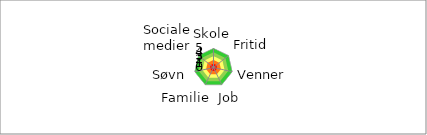
| Category | Series 5 | Series 4 | Series 3 | Series 2 | Series 1 | Series 0 |
|---|---|---|---|---|---|---|
| Skole | 5 | 4 | 3 | 2 | 1 |  |
| Fritid | 5 | 4 | 3 | 2 | 1 |  |
| Venner | 5 | 4 | 3 | 2 | 1 |  |
| Job | 5 | 4 | 3 | 2 | 1 |  |
| Familie | 5 | 4 | 3 | 2 | 1 |  |
| Søvn | 5 | 4 | 3 | 2 | 1 |  |
| Sociale medier | 5 | 4 | 3 | 2 | 1 |  |